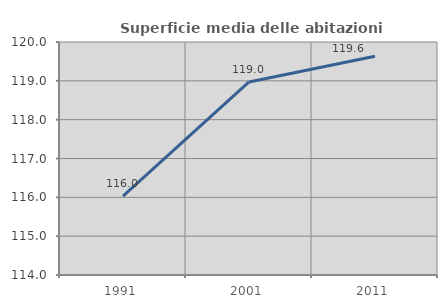
| Category | Superficie media delle abitazioni occupate |
|---|---|
| 1991.0 | 116.031 |
| 2001.0 | 118.972 |
| 2011.0 | 119.631 |